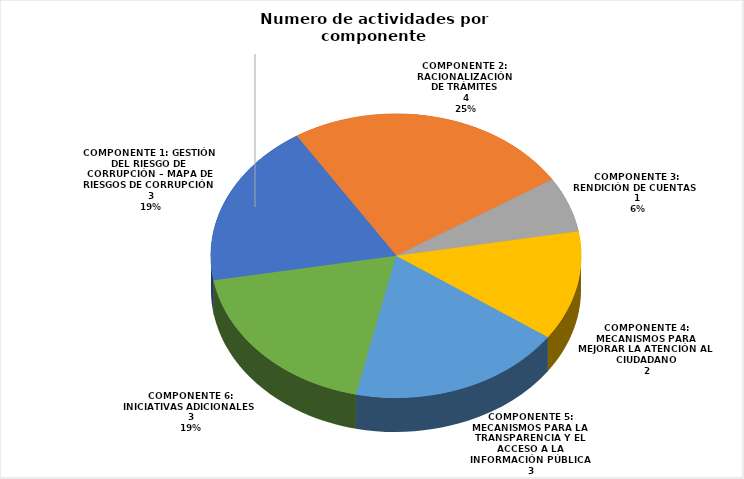
| Category | Cantidad de Actividades |
|---|---|
| COMPONENTE 1: GESTIÓN DEL RIESGO DE CORRUPCIÓN – MAPA DE RIESGOS DE CORRUPCIÓN | 3 |
| COMPONENTE 2: RACIONALIZACIÓN DE TRÁMITES | 4 |
| COMPONENTE 3: RENDICIÓN DE CUENTAS | 1 |
| COMPONENTE 4: MECANISMOS PARA MEJORAR LA ATENCIÓN AL CIUDADANO | 2 |
| COMPONENTE 5: MECANISMOS PARA LA TRANSPARENCIA Y EL ACCESO A LA INFORMACIÓN PÚBLICA | 3 |
| COMPONENTE 6: INICIATIVAS ADICIONALES | 3 |